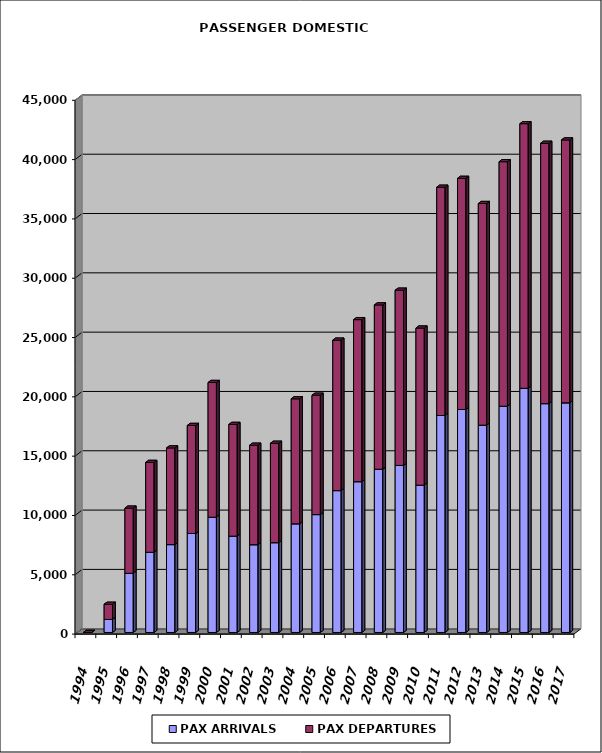
| Category | PAX ARRIVALS | PAX DEPARTURES |
|---|---|---|
| 1994.0 | 0 | 0 |
| 1995.0 | 1100 | 1279 |
| 1996.0 | 4988 | 5495 |
| 1997.0 | 6761 | 7576 |
| 1998.0 | 7408 | 8150 |
| 1999.0 | 8348 | 9105 |
| 2000.0 | 9716 | 11359 |
| 2001.0 | 8121 | 9419 |
| 2002.0 | 7400 | 8387 |
| 2003.0 | 7571 | 8381 |
| 2004.0 | 9164 | 10534 |
| 2005.0 | 9939 | 10065 |
| 2006.0 | 11961 | 12681 |
| 2007.0 | 12714 | 13658 |
| 2008.0 | 13764 | 13849 |
| 2009.0 | 14084 | 14771 |
| 2010.0 | 12419 | 13245 |
| 2011.0 | 18291 | 19243 |
| 2012.0 | 18799 | 19483 |
| 2013.0 | 17477 | 18685 |
| 2014.0 | 19074 | 20612 |
| 2015.0 | 20584 | 22308 |
| 2016.0 | 19292 | 21947 |
| 2017.0 | 19361 | 22160 |